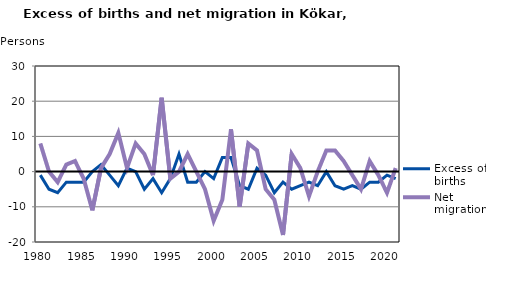
| Category | Excess of births | Net migration |
|---|---|---|
| 1980.0 | -1 | 8 |
| 1981.0 | -5 | 0 |
| 1982.0 | -6 | -3 |
| 1983.0 | -3 | 2 |
| 1984.0 | -3 | 3 |
| 1985.0 | -3 | -2 |
| 1986.0 | 0 | -11 |
| 1987.0 | 2 | 1 |
| 1988.0 | -1 | 5 |
| 1989.0 | -4 | 11 |
| 1990.0 | 1 | 1 |
| 1991.0 | 0 | 8 |
| 1992.0 | -5 | 5 |
| 1993.0 | -2 | -1 |
| 1994.0 | -6 | 21 |
| 1995.0 | -2 | -2 |
| 1996.0 | 5 | 0 |
| 1997.0 | -3 | 5 |
| 1998.0 | -3 | 0 |
| 1999.0 | 0 | -5 |
| 2000.0 | -2 | -14 |
| 2001.0 | 4 | -8 |
| 2002.0 | 4 | 12 |
| 2003.0 | -4 | -10 |
| 2004.0 | -5 | 8 |
| 2005.0 | 1 | 6 |
| 2006.0 | -1 | -5 |
| 2007.0 | -6 | -8 |
| 2008.0 | -3 | -18 |
| 2009.0 | -5 | 5 |
| 2010.0 | -4 | 1 |
| 2011.0 | -3 | -7 |
| 2012.0 | -4 | 0 |
| 2013.0 | 0 | 6 |
| 2014.0 | -4 | 6 |
| 2015.0 | -5 | 3 |
| 2016.0 | -4 | -1 |
| 2017.0 | -5 | -5 |
| 2018.0 | -3 | 3 |
| 2019.0 | -3 | -1 |
| 2020.0 | -1 | -6 |
| 2021.0 | -2 | 1 |